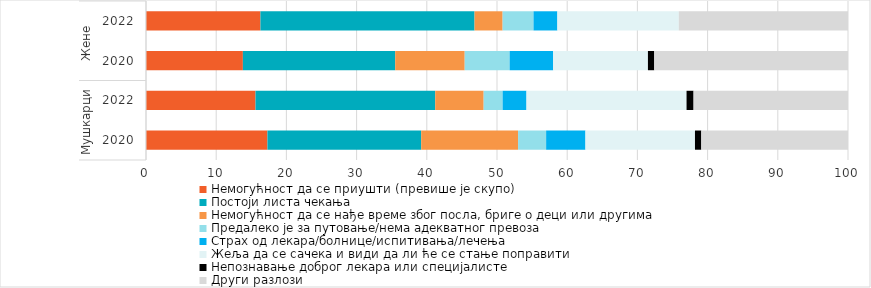
| Category | Немогућност да се приушти (превише је скупо) | Постоји листа чекања | Немогућност да се нађе време због посла, бриге о деци или другима | Предалеко је за путовање/нема адекватног превоза | Страх од лекара/болнице/испитивања/лечења | Жеља да се сачека и види да ли ће се стање поправити | Непознавање доброг лекара или специјалисте | Други разлози |
|---|---|---|---|---|---|---|---|---|
| 0 | 17.3 | 21.9 | 13.8 | 4 | 5.6 | 15.6 | 0.9 | 20.9 |
| 1 | 15.6 | 25.6 | 6.9 | 2.7 | 3.4 | 22.8 | 1 | 22 |
| 2 | 13.8 | 21.7 | 9.9 | 6.4 | 6.2 | 13.5 | 0.9 | 27.6 |
| 3 | 16.3 | 30.5 | 4 | 4.4 | 3.4 | 17.3 | 0 | 24.1 |